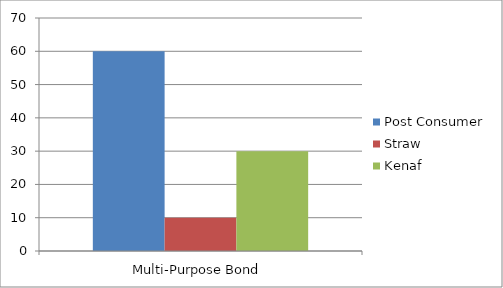
| Category | Post Consumer | Straw | Kenaf |
|---|---|---|---|
| Multi-Purpose Bond  | 60 | 10 | 30 |